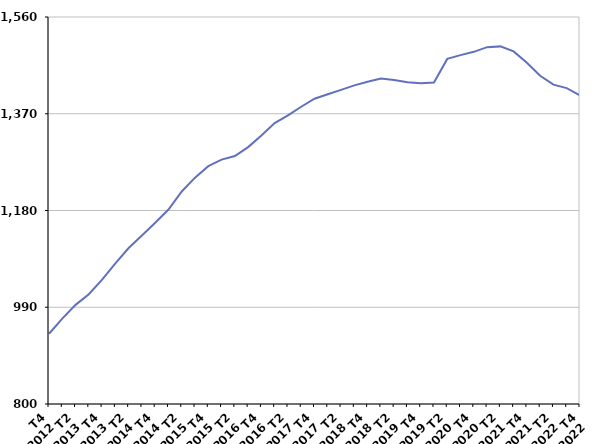
| Category | 50 ans ou plus |
|---|---|
| T4
2012 | 938 |
| T1
2013 | 967.6 |
| T2
2013 | 994.7 |
| T3
2013 | 1015.6 |
| T4
2013 | 1044.2 |
| T1
2014 | 1076.2 |
| T2
2014 | 1106.4 |
| T3
2014 | 1130.8 |
| T4
2014 | 1155.9 |
| T1
2015 | 1181.8 |
| T2
2015 | 1217.4 |
| T3
2015 | 1244.5 |
| T4
2015 | 1267 |
| T1
2016 | 1279.9 |
| T2
2016 | 1287.1 |
| T3
2016 | 1304.5 |
| T4
2016 | 1327.1 |
| T1
2017 | 1351.7 |
| T2
2017 | 1366.9 |
| T3
2017 | 1383.8 |
| T4
2017 | 1399.6 |
| T1
2018 | 1408.3 |
| T2
2018 | 1416.9 |
| T3
2018 | 1425.8 |
| T4
2018 | 1433 |
| T1
2019 | 1439.4 |
| T2
2019 | 1436.4 |
| T3
2019 | 1432 |
| T4
2019 | 1429.9 |
| T1
2020 | 1431.4 |
| T2
2020 | 1477.7 |
| T3
2020 | 1485.1 |
| T4
2020 | 1491.6 |
| T1
2021 | 1500.8 |
| T2
2021 | 1502.3 |
| T3
2021 | 1492.4 |
| T4
2021 | 1470.1 |
| T1
2022 | 1444.6 |
| T2
2022 | 1427.1 |
| T3
2022 | 1420.3 |
| T4
2022 | 1406.2 |